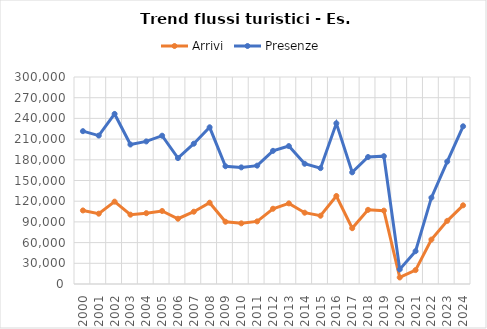
| Category | Arrivi | Presenze |
|---|---|---|
| 2000.0 | 106607 | 221492 |
| 2001.0 | 101902 | 215107 |
| 2002.0 | 119338 | 246459 |
| 2003.0 | 100454 | 202167 |
| 2004.0 | 102643 | 206631 |
| 2005.0 | 105819 | 214922 |
| 2006.0 | 94588 | 182474 |
| 2007.0 | 104769 | 203340 |
| 2008.0 | 117794 | 227082 |
| 2009.0 | 90259 | 170669 |
| 2010.0 | 87902 | 169014 |
| 2011.0 | 90731 | 171541 |
| 2012.0 | 109082 | 192996 |
| 2013.0 | 116840 | 199885 |
| 2014.0 | 103346 | 174253 |
| 2015.0 | 98963 | 167915 |
| 2016.0 | 127553 | 232866 |
| 2017.0 | 80860 | 161841 |
| 2018.0 | 107495 | 184002 |
| 2019.0 | 106336 | 185265 |
| 2020.0 | 9474 | 21202 |
| 2021.0 | 20151 | 47518 |
| 2022.0 | 64401 | 125115 |
| 2023.0 | 91526 | 177465 |
| 2024.0 | 114044 | 228553 |